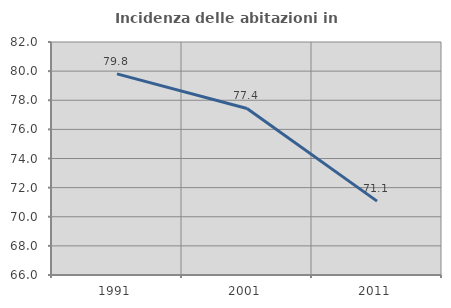
| Category | Incidenza delle abitazioni in proprietà  |
|---|---|
| 1991.0 | 79.812 |
| 2001.0 | 77.438 |
| 2011.0 | 71.074 |